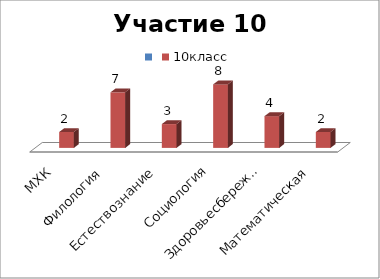
| Category | Series 0 | 10класс |
|---|---|---|
| МХК |  | 2 |
| Филология |  | 7 |
| Естествознание |  | 3 |
| Социология |  | 8 |
| Здоровьесбережение |  | 4 |
| Математическая |  | 2 |